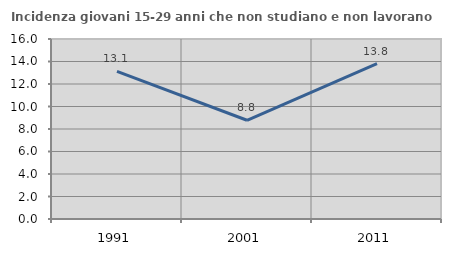
| Category | Incidenza giovani 15-29 anni che non studiano e non lavorano  |
|---|---|
| 1991.0 | 13.118 |
| 2001.0 | 8.777 |
| 2011.0 | 13.813 |